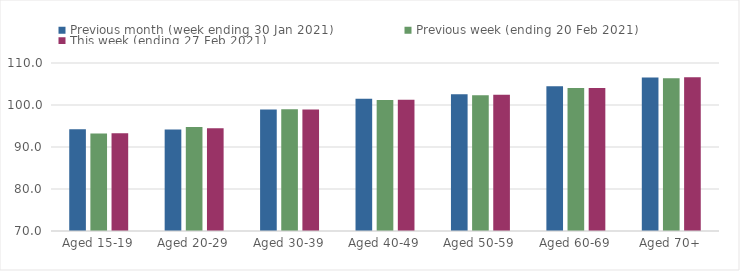
| Category | Previous month (week ending 30 Jan 2021) | Previous week (ending 20 Feb 2021) | This week (ending 27 Feb 2021) |
|---|---|---|---|
| Aged 15-19 | 94.24 | 93.19 | 93.25 |
| Aged 20-29 | 94.18 | 94.76 | 94.48 |
| Aged 30-39 | 98.95 | 98.98 | 98.9 |
| Aged 40-49 | 101.46 | 101.21 | 101.26 |
| Aged 50-59 | 102.53 | 102.31 | 102.46 |
| Aged 60-69 | 104.49 | 104.06 | 104.05 |
| Aged 70+ | 106.56 | 106.39 | 106.58 |